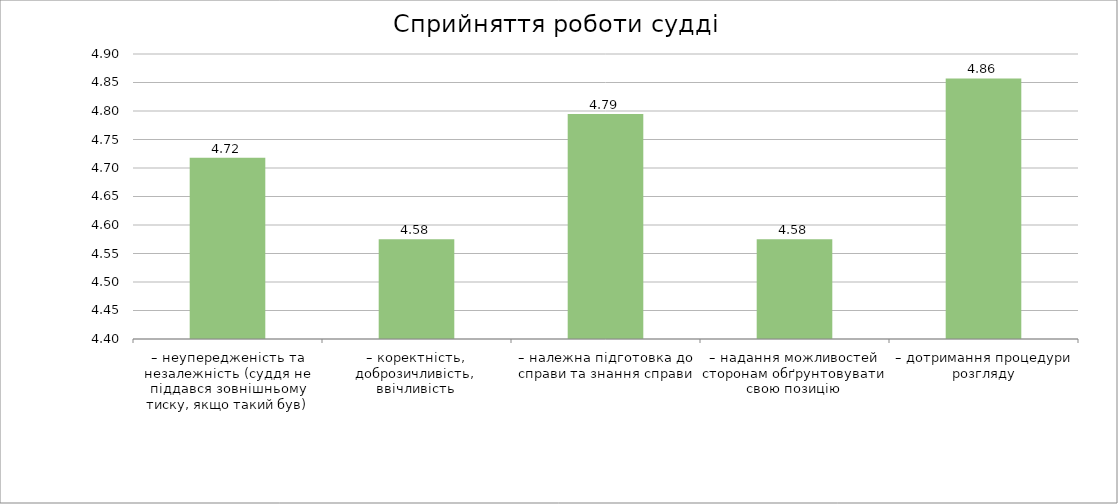
| Category | Series 0 |
|---|---|
| – неупередженість та незалежність (суддя не піддався зовнішньому тиску, якщо такий був) | 4.718 |
| – коректність, доброзичливість, ввічливість | 4.575 |
| – належна підготовка до справи та знання справи | 4.795 |
| – надання можливостей сторонам обґрунтовувати свою позицію | 4.575 |
| – дотримання процедури розгляду | 4.857 |